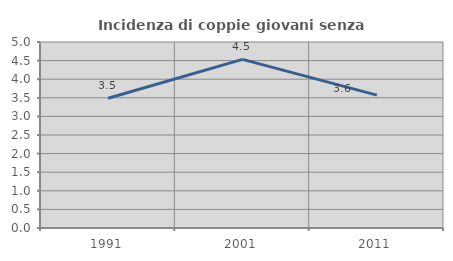
| Category | Incidenza di coppie giovani senza figli |
|---|---|
| 1991.0 | 3.488 |
| 2001.0 | 4.532 |
| 2011.0 | 3.571 |